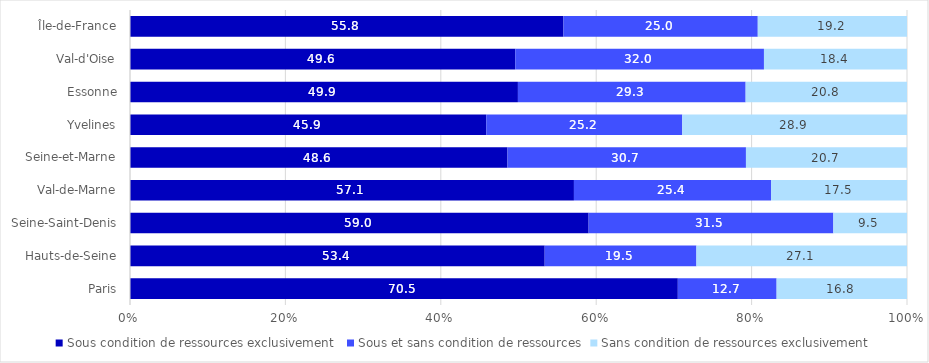
| Category | Sous condition de ressources exclusivement  | Sous et sans condition de ressources | Sans condition de ressources exclusivement |
|---|---|---|---|
| Paris | 70.504 | 12.715 | 16.781 |
| Hauts-de-Seine | 53.371 | 19.528 | 27.101 |
| Seine-Saint-Denis | 59.025 | 31.496 | 9.479 |
| Val-de-Marne | 57.135 | 25.367 | 17.498 |
| Seine-et-Marne | 48.583 | 30.689 | 20.728 |
| Yvelines | 45.851 | 25.225 | 28.924 |
| Essonne | 49.925 | 29.307 | 20.768 |
| Val-d'Oise | 49.583 | 32.007 | 18.41 |
| Île-de-France | 55.785 | 25.01 | 19.205 |